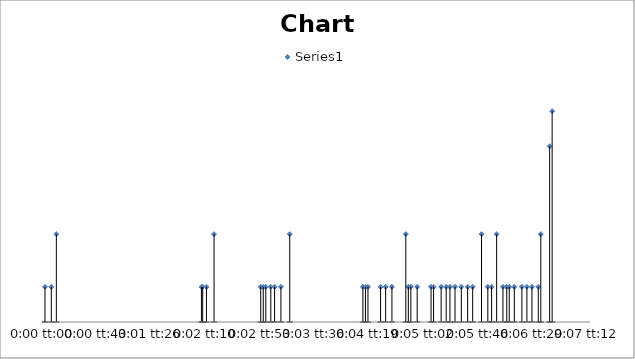
| Category | Series 0 |
|---|---|
| 0.0 | 2 |
| 5.787037037037479e-05 | 2 |
| 0.0001041666666666552 | 5 |
| 0.0014351851851851782 | 2 |
| 0.0014467592592592587 | 2 |
| 0.0014814814814814864 | 2 |
| 0.0015509259259259278 | 5 |
| 0.0019791666666666707 | 2 |
| 0.002002314814814804 | 2 |
| 0.002025462962962965 | 2 |
| 0.0020717592592592593 | 2 |
| 0.002106481481481473 | 2 |
| 0.002164351851851848 | 2 |
| 0.00224537037037037 | 5 |
| 0.0029166666666666785 | 2 |
| 0.0029398148148148118 | 2 |
| 0.002962962962962959 | 2 |
| 0.0030787037037036946 | 2 |
| 0.0031250000000000028 | 2 |
| 0.0031828703703703776 | 2 |
| 0.00331018518518518 | 5 |
| 0.003333333333333327 | 2 |
| 0.003356481481481488 | 2 |
| 0.003414351851851849 | 2 |
| 0.003541666666666665 | 2 |
| 0.0035648148148148123 | 2 |
| 0.0036342592592592537 | 2 |
| 0.003680555555555548 | 2 |
| 0.0037152777777777757 | 2 |
| 0.00376157407407407 | 2 |
| 0.0038194444444444448 | 2 |
| 0.0038773148148148195 | 2 |
| 0.003923611111111114 | 2 |
| 0.004004629629629622 | 5 |
| 0.004062499999999997 | 2 |
| 0.004097222222222224 | 2 |
| 0.004143518518518519 | 5 |
| 0.004201388888888893 | 2 |
| 0.004236111111111107 | 2 |
| 0.004259259259259254 | 2 |
| 0.0043055555555555625 | 2 |
| 0.004375000000000004 | 2 |
| 0.004421296296296298 | 2 |
| 0.0044675925925925924 | 2 |
| 0.004525462962962967 | 2 |
| 0.004548611111111114 | 5 |
| 0.0046296296296296224 | 10 |
| 0.0046527777777777835 | 12 |